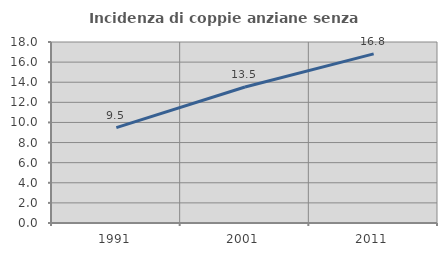
| Category | Incidenza di coppie anziane senza figli  |
|---|---|
| 1991.0 | 9.483 |
| 2001.0 | 13.527 |
| 2011.0 | 16.815 |